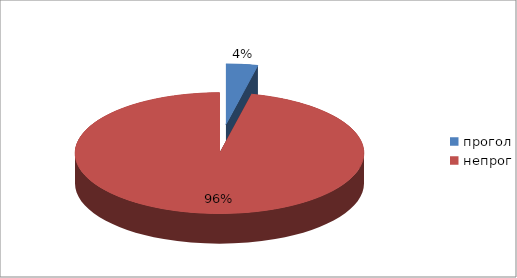
| Category | Series 0 |
|---|---|
| прогол | 7 |
| непрог | 191 |